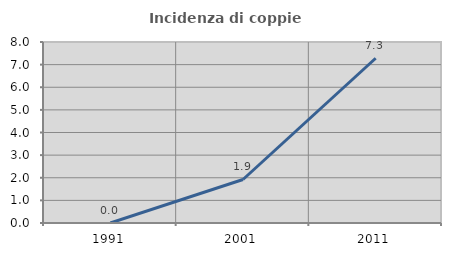
| Category | Incidenza di coppie miste |
|---|---|
| 1991.0 | 0 |
| 2001.0 | 1.923 |
| 2011.0 | 7.282 |